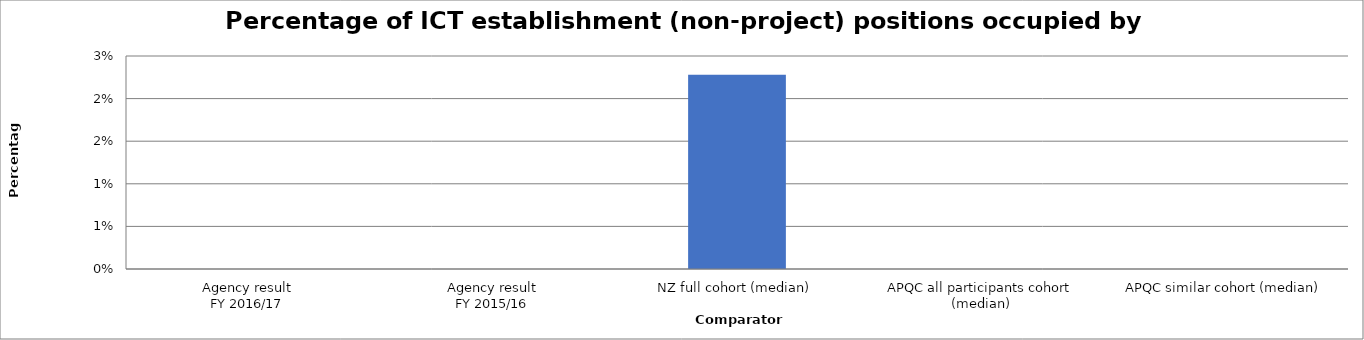
| Category | Result |
|---|---|
| Agency result
FY 2016/17 | 0 |
| Agency result
FY 2015/16 | 0 |
| NZ full cohort (median) | 0.023 |
| APQC all participants cohort (median) | 0 |
| APQC similar cohort (median) | 0 |